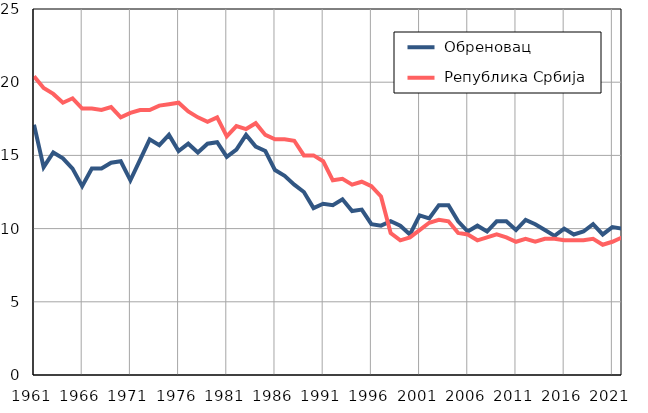
| Category |  Обреновац |  Република Србија |
|---|---|---|
| 1961.0 | 17.1 | 20.4 |
| 1962.0 | 14.2 | 19.6 |
| 1963.0 | 15.2 | 19.2 |
| 1964.0 | 14.8 | 18.6 |
| 1965.0 | 14.1 | 18.9 |
| 1966.0 | 12.9 | 18.2 |
| 1967.0 | 14.1 | 18.2 |
| 1968.0 | 14.1 | 18.1 |
| 1969.0 | 14.5 | 18.3 |
| 1970.0 | 14.6 | 17.6 |
| 1971.0 | 13.3 | 17.9 |
| 1972.0 | 14.7 | 18.1 |
| 1973.0 | 16.1 | 18.1 |
| 1974.0 | 15.7 | 18.4 |
| 1975.0 | 16.4 | 18.5 |
| 1976.0 | 15.3 | 18.6 |
| 1977.0 | 15.8 | 18 |
| 1978.0 | 15.2 | 17.6 |
| 1979.0 | 15.8 | 17.3 |
| 1980.0 | 15.9 | 17.6 |
| 1981.0 | 14.9 | 16.3 |
| 1982.0 | 15.4 | 17 |
| 1983.0 | 16.4 | 16.8 |
| 1984.0 | 15.6 | 17.2 |
| 1985.0 | 15.3 | 16.4 |
| 1986.0 | 14 | 16.1 |
| 1987.0 | 13.6 | 16.1 |
| 1988.0 | 13 | 16 |
| 1989.0 | 12.5 | 15 |
| 1990.0 | 11.4 | 15 |
| 1991.0 | 11.7 | 14.6 |
| 1992.0 | 11.6 | 13.3 |
| 1993.0 | 12 | 13.4 |
| 1994.0 | 11.2 | 13 |
| 1995.0 | 11.3 | 13.2 |
| 1996.0 | 10.3 | 12.9 |
| 1997.0 | 10.2 | 12.2 |
| 1998.0 | 10.5 | 9.7 |
| 1999.0 | 10.2 | 9.2 |
| 2000.0 | 9.6 | 9.4 |
| 2001.0 | 10.9 | 9.9 |
| 2002.0 | 10.7 | 10.4 |
| 2003.0 | 11.6 | 10.6 |
| 2004.0 | 11.6 | 10.5 |
| 2005.0 | 10.5 | 9.7 |
| 2006.0 | 9.8 | 9.6 |
| 2007.0 | 10.2 | 9.2 |
| 2008.0 | 9.8 | 9.4 |
| 2009.0 | 10.5 | 9.6 |
| 2010.0 | 10.5 | 9.4 |
| 2011.0 | 9.9 | 9.1 |
| 2012.0 | 10.6 | 9.3 |
| 2013.0 | 10.3 | 9.1 |
| 2014.0 | 9.9 | 9.3 |
| 2015.0 | 9.5 | 9.3 |
| 2016.0 | 10 | 9.2 |
| 2017.0 | 9.6 | 9.2 |
| 2018.0 | 9.8 | 9.2 |
| 2019.0 | 10.3 | 9.3 |
| 2020.0 | 9.6 | 8.9 |
| 2021.0 | 10.1 | 9.1 |
| 2022.0 | 10 | 9.4 |